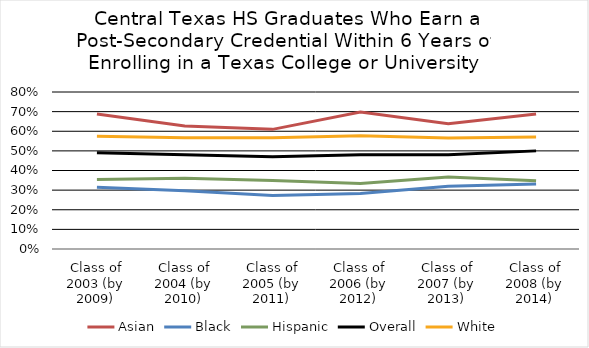
| Category | Asian | Black | Hispanic | Overall | White |
|---|---|---|---|---|---|
| Class of 2003 (by 2009) | 0.688 | 0.314 | 0.354 | 0.49 | 0.574 |
| Class of 2004 (by 2010) | 0.626 | 0.297 | 0.361 | 0.48 | 0.567 |
| Class of 2005 (by 2011) | 0.61 | 0.272 | 0.349 | 0.47 | 0.566 |
| Class of 2006 (by 2012) | 0.698 | 0.283 | 0.334 | 0.48 | 0.578 |
| Class of 2007 (by 2013) | 0.639 | 0.32 | 0.367 | 0.48 | 0.565 |
| Class of 2008 (by 2014) | 0.688 | 0.332 | 0.347 | 0.5 | 0.571 |